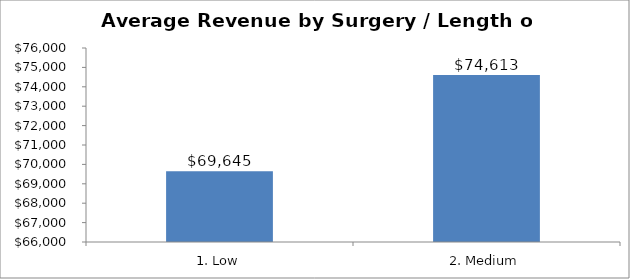
| Category | Total |
|---|---|
| 1. Low | 69645.198 |
| 2. Medium | 74612.753 |